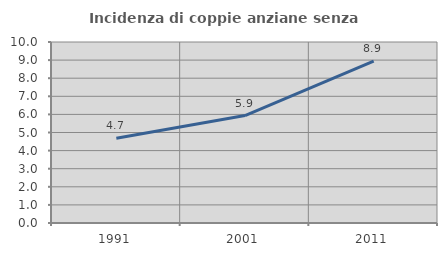
| Category | Incidenza di coppie anziane senza figli  |
|---|---|
| 1991.0 | 4.684 |
| 2001.0 | 5.934 |
| 2011.0 | 8.944 |